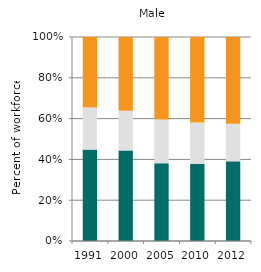
| Category | Agriculture | Industry | Services |
|---|---|---|---|
| 1991.0 | 44.794 | 20.604 | 34.602 |
| 2000.0 | 44.394 | 19.504 | 36.101 |
| 2005.0 | 38.1 | 21.403 | 40.498 |
| 2010.0 | 37.877 | 20.184 | 41.939 |
| 2012.0 | 39.032 | 18.477 | 42.491 |